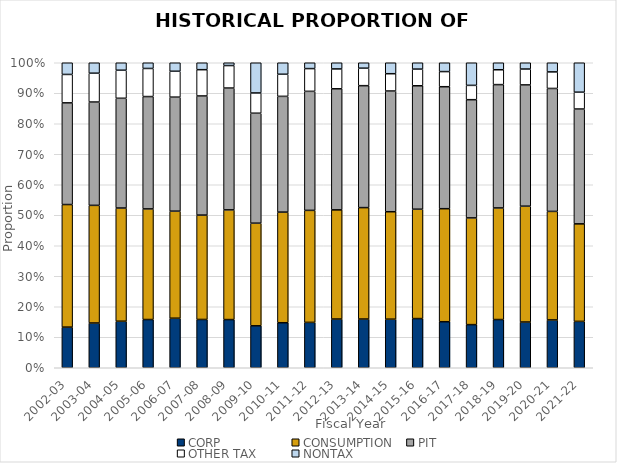
| Category | CORP | CONSUMPTION | PIT | OTHER TAX | NONTAX |
|---|---|---|---|---|---|
| 2002-03 | 0.133 | 0.402 | 0.333 | 0.093 | 0.038 |
| 2003-04 | 0.147 | 0.386 | 0.339 | 0.095 | 0.034 |
| 2004-05 | 0.153 | 0.371 | 0.36 | 0.092 | 0.025 |
| 2005-06 | 0.158 | 0.363 | 0.368 | 0.092 | 0.019 |
| 2006-07 | 0.162 | 0.351 | 0.374 | 0.085 | 0.028 |
| 2007-08 | 0.158 | 0.342 | 0.391 | 0.086 | 0.023 |
| 2008-09 | 0.158 | 0.36 | 0.399 | 0.074 | 0.009 |
| 2009-10 | 0.138 | 0.336 | 0.361 | 0.066 | 0.099 |
| 2010-11 | 0.148 | 0.363 | 0.38 | 0.072 | 0.038 |
| 2011-12 | 0.149 | 0.367 | 0.39 | 0.075 | 0.019 |
| 2012-13 | 0.16 | 0.358 | 0.397 | 0.065 | 0.02 |
| 2013-14 | 0.16 | 0.365 | 0.4 | 0.057 | 0.018 |
| 2014-15 | 0.159 | 0.352 | 0.396 | 0.057 | 0.036 |
| 2015-16 | 0.161 | 0.359 | 0.405 | 0.055 | 0.021 |
| 2016-17 | 0.151 | 0.371 | 0.4 | 0.05 | 0.029 |
| 2017-18 | 0.141 | 0.35 | 0.388 | 0.047 | 0.074 |
| 2018-19 | 0.158 | 0.366 | 0.404 | 0.049 | 0.023 |
| 2019-20 | 0.15 | 0.38 | 0.398 | 0.052 | 0.021 |
| 2020-21 | 0.157 | 0.356 | 0.403 | 0.054 | 0.03 |
| 2021-22 | 0.152 | 0.32 | 0.377 | 0.055 | 0.097 |